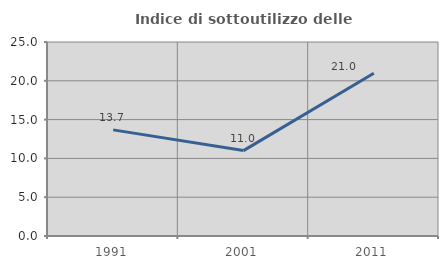
| Category | Indice di sottoutilizzo delle abitazioni  |
|---|---|
| 1991.0 | 13.675 |
| 2001.0 | 11.005 |
| 2011.0 | 20.976 |